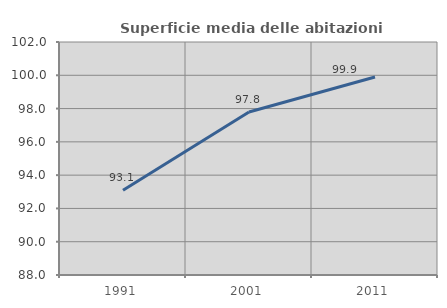
| Category | Superficie media delle abitazioni occupate |
|---|---|
| 1991.0 | 93.095 |
| 2001.0 | 97.791 |
| 2011.0 | 99.895 |